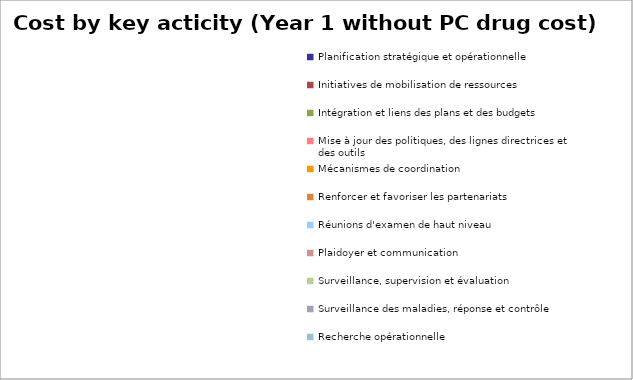
| Category | Series 0 |
|---|---|
| Planification stratégique et opérationnelle | 0 |
| Initiatives de mobilisation de ressources | 0 |
| Intégration et liens des plans et des budgets | 0 |
| Mise à jour des politiques, des lignes directrices et des outils | 0 |
| Mécanismes de coordination | 0 |
| Renforcer et favoriser les partenariats | 0 |
| Réunions d'examen de haut niveau | 0 |
| Plaidoyer et communication | 0 |
| Surveillance, supervision et évaluation | 0 |
| Surveillance des maladies, réponse et contrôle | 0 |
| Recherche opérationnelle | 0 |